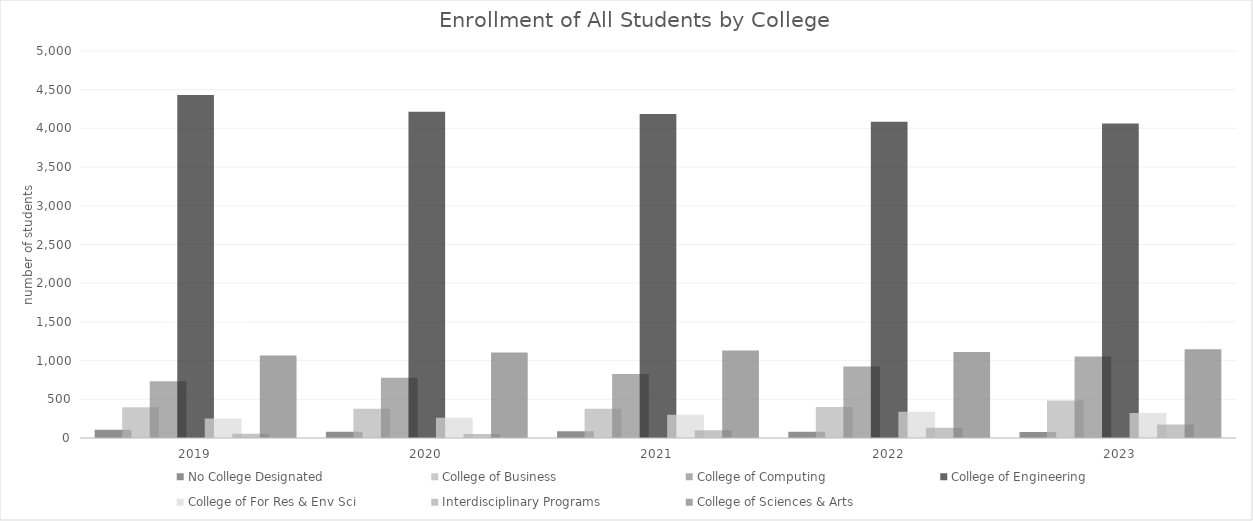
| Category | No College Designated | College of Business | College of Computing | College of Engineering | College of For Res & Env Sci | Interdisciplinary Programs | College of Sciences & Arts |
|---|---|---|---|---|---|---|---|
| 2019 | 108 | 397 | 734 | 4430 | 251 | 54 | 1067 |
| 2020 | 82 | 378 | 779 | 4216 | 261 | 53 | 1106 |
| 2021 | 88 | 379 | 827 | 4185 | 299 | 99 | 1132 |
| 2022 | 82 | 401 | 923 | 4085 | 338 | 134 | 1111 |
| 2023 | 76 | 484 | 1054 | 4064 | 322 | 176 | 1148 |